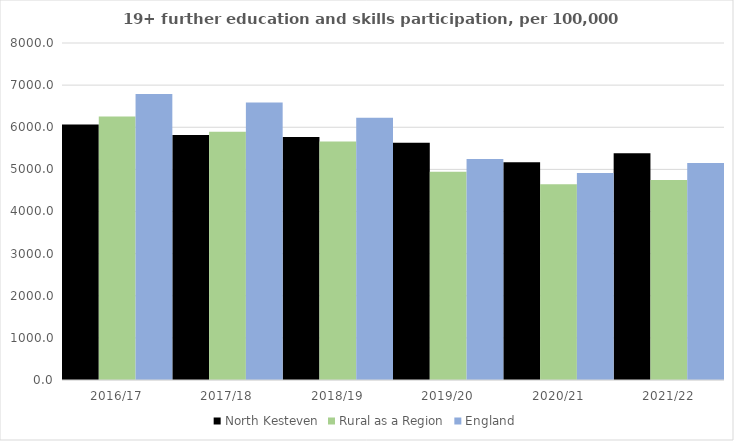
| Category | North Kesteven | Rural as a Region | England |
|---|---|---|---|
| 2016/17 | 6063 | 6253.401 | 6788 |
| 2017/18 | 5814 | 5892.029 | 6588 |
| 2018/19 | 5769 | 5661.873 | 6227 |
| 2019/20 | 5630 | 4943.801 | 5244 |
| 2020/21 | 5169 | 4646.727 | 4913 |
| 2021/22 | 5385 | 4747.049 | 5151 |